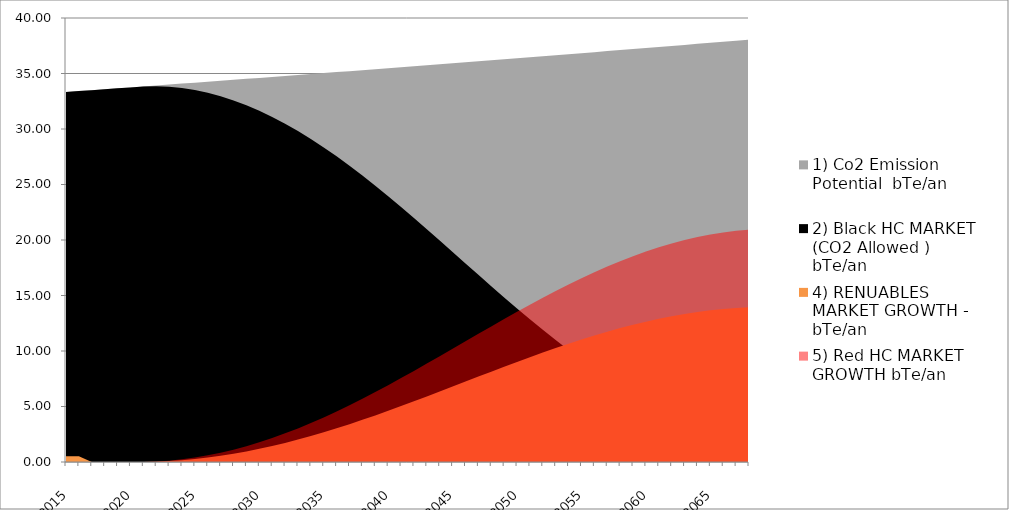
| Category | 1) Co2 Emission Potential  | 2) Black HC MARKET (CO2 Allowed ) | 4) RENUABLES  MARKET GROWTH -  | 5) Red HC MARKET GROWTH |
|---|---|---|---|---|
| 2015.0 | 33.331 | 33.331 | 0.52 | 0 |
| 2016.0 | 33.415 | 33.415 | 0.526 | 0 |
| 2017.0 | 33.498 | 33.498 | 0 | 0 |
| 2018.0 | 33.582 | 33.582 | 0 | 0 |
| 2019.0 | 33.666 | 33.666 | 0 | 0 |
| 2020.0 | 33.75 | 33.75 | 0 | 0 |
| 2021.0 | 33.834 | 33.834 | 0 | 0 |
| 2022.0 | 33.919 | 33.852 | 0.027 | 0.04 |
| 2023.0 | 34.004 | 33.804 | 0.08 | 0.12 |
| 2024.0 | 34.089 | 33.689 | 0.16 | 0.24 |
| 2025.0 | 34.174 | 33.508 | 0.266 | 0.4 |
| 2026.0 | 34.259 | 33.261 | 0.399 | 0.599 |
| 2027.0 | 34.345 | 32.95 | 0.558 | 0.837 |
| 2028.0 | 34.431 | 32.576 | 0.742 | 1.113 |
| 2029.0 | 34.517 | 32.139 | 0.951 | 1.427 |
| 2030.0 | 34.603 | 31.643 | 1.184 | 1.776 |
| 2031.0 | 34.69 | 31.088 | 1.441 | 2.161 |
| 2032.0 | 34.777 | 30.478 | 1.719 | 2.579 |
| 2033.0 | 34.863 | 29.815 | 2.019 | 3.029 |
| 2034.0 | 34.951 | 29.101 | 2.34 | 3.51 |
| 2035.0 | 35.038 | 28.34 | 2.679 | 4.019 |
| 2036.0 | 35.126 | 27.535 | 3.036 | 4.555 |
| 2037.0 | 35.213 | 26.689 | 3.41 | 5.115 |
| 2038.0 | 35.301 | 25.805 | 3.798 | 5.698 |
| 2039.0 | 35.39 | 24.889 | 4.2 | 6.3 |
| 2040.0 | 35.478 | 23.943 | 4.614 | 6.921 |
| 2041.0 | 35.567 | 22.973 | 5.038 | 7.557 |
| 2042.0 | 35.656 | 21.981 | 5.47 | 8.205 |
| 2043.0 | 35.745 | 20.973 | 5.909 | 8.863 |
| 2044.0 | 35.834 | 19.952 | 6.353 | 9.529 |
| 2045.0 | 35.924 | 18.925 | 6.8 | 10.2 |
| 2046.0 | 36.014 | 17.894 | 7.248 | 10.872 |
| 2047.0 | 36.104 | 16.865 | 7.696 | 11.543 |
| 2048.0 | 36.194 | 15.842 | 8.141 | 12.211 |
| 2049.0 | 36.284 | 14.83 | 8.582 | 12.873 |
| 2050.0 | 36.375 | 13.834 | 9.017 | 13.525 |
| 2051.0 | 36.466 | 12.858 | 9.443 | 14.165 |
| 2052.0 | 36.557 | 11.906 | 9.86 | 14.791 |
| 2053.0 | 36.649 | 10.984 | 10.266 | 15.399 |
| 2054.0 | 36.74 | 10.095 | 10.658 | 15.987 |
| 2055.0 | 36.832 | 9.243 | 11.035 | 16.553 |
| 2056.0 | 36.924 | 8.434 | 11.396 | 17.094 |
| 2057.0 | 37.017 | 7.67 | 11.739 | 17.608 |
| 2058.0 | 37.109 | 6.955 | 12.062 | 18.093 |
| 2059.0 | 37.202 | 6.293 | 12.364 | 18.545 |
| 2060.0 | 37.295 | 5.687 | 12.643 | 18.965 |
| 2061.0 | 37.388 | 5.14 | 12.899 | 19.349 |
| 2062.0 | 37.482 | 4.656 | 13.13 | 19.695 |
| 2063.0 | 37.575 | 4.236 | 13.336 | 20.004 |
| 2064.0 | 37.669 | 3.883 | 13.514 | 20.272 |
| 2065.0 | 37.763 | 3.6 | 13.665 | 20.498 |
| 2066.0 | 37.858 | 3.387 | 13.788 | 20.682 |
| 2067.0 | 37.952 | 3.247 | 13.882 | 20.823 |
| 2068.0 | 38.047 | 3.181 | 13.947 | 20.92 |